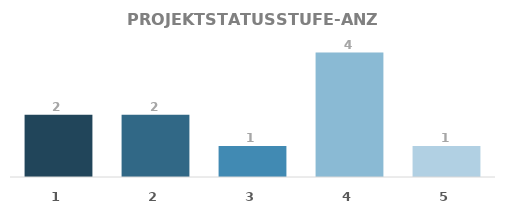
| Category | MENGE |
|---|---|
| 1.0 | 2 |
| 2.0 | 2 |
| 3.0 | 1 |
| 4.0 | 4 |
| 5.0 | 1 |